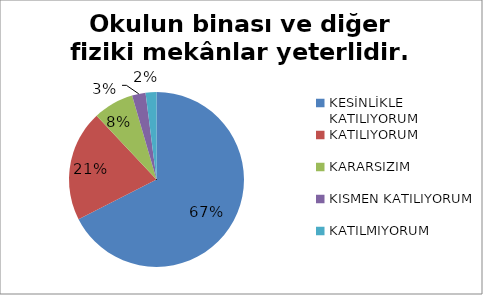
| Category | Okulun binası ve diğer fiziki mekânlar yeterlidir. |
|---|---|
| KESİNLİKLE KATILIYORUM | 135 |
| KATILIYORUM | 41 |
| KARARSIZIM | 15 |
| KISMEN KATILIYORUM | 5 |
| KATILMIYORUM | 4 |